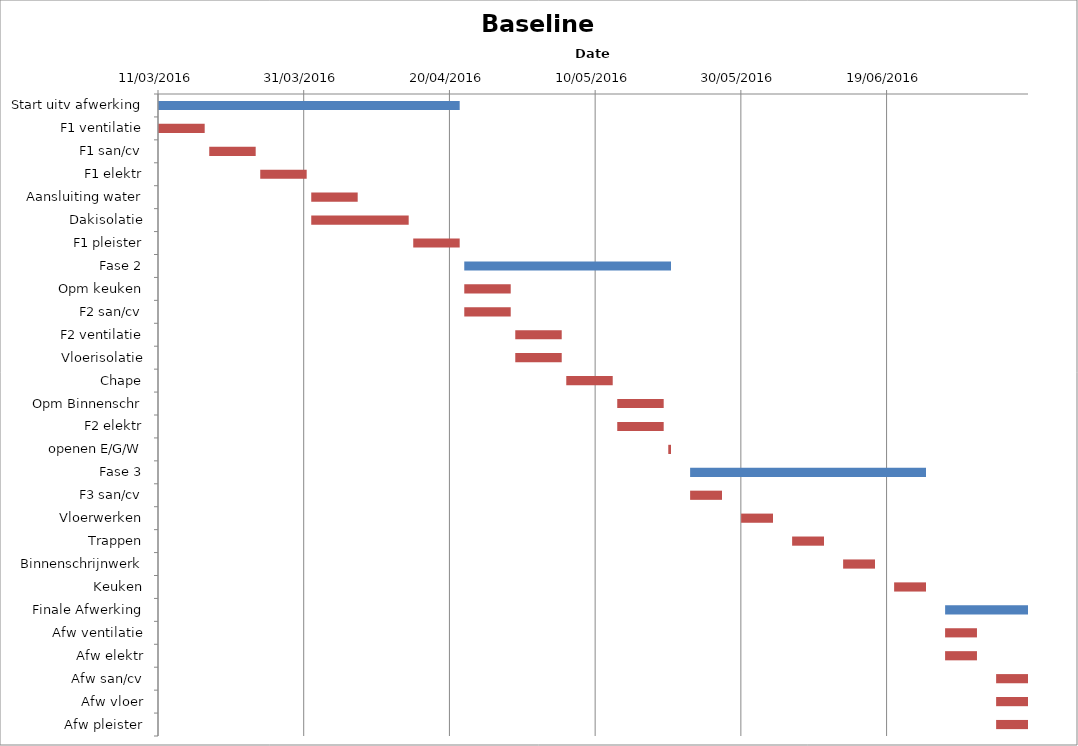
| Category | Baseline start | Actual duration |
|---|---|---|
| Start uitv afwerking | 42440.333 | 41.375 |
| F1 ventilatie | 42440.333 | 6.375 |
| F1 san/cv | 42447.333 | 6.375 |
| F1 elektr | 42454.333 | 6.375 |
| Aansluiting water | 42461.333 | 6.375 |
| Dakisolatie | 42461.333 | 13.375 |
| F1 pleister | 42475.333 | 6.375 |
| Fase 2 | 42482.333 | 28.375 |
| Opm keuken | 42482.333 | 6.375 |
| F2 san/cv | 42482.333 | 6.375 |
| F2 ventilatie | 42489.333 | 6.375 |
| Vloerisolatie | 42489.333 | 6.375 |
| Chape | 42496.333 | 6.375 |
| Opm Binnenschr | 42503.333 | 6.375 |
| F2 elektr | 42503.333 | 6.375 |
| openen E/G/W | 42510.333 | 0.375 |
| Fase 3 | 42513.333 | 32.375 |
| F3 san/cv | 42513.333 | 4.375 |
| Vloerwerken | 42520.333 | 4.375 |
| Trappen | 42527.333 | 4.375 |
| Binnenschrijnwerk | 42534.333 | 4.375 |
| Keuken | 42541.333 | 4.375 |
| Finale Afwerking | 42548.333 | 11.375 |
| Afw ventilatie | 42548.333 | 4.375 |
| Afw elektr | 42548.333 | 4.375 |
| Afw san/cv | 42555.333 | 4.375 |
| Afw vloer | 42555.333 | 4.375 |
| Afw pleister | 42555.333 | 4.375 |